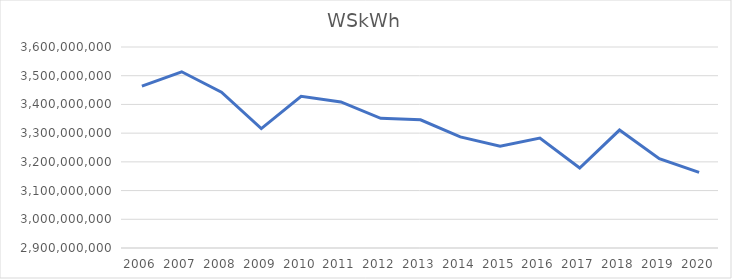
| Category |  WSkWh  |
|---|---|
| 2006.0 | 3463554919 |
| 2007.0 | 3513738064 |
| 2008.0 | 3442614476 |
| 2009.0 | 3315882997 |
| 2010.0 | 3428161401.37 |
| 2011.0 | 3408628157.038 |
| 2012.0 | 3351442979.309 |
| 2013.0 | 3346449708.869 |
| 2014.0 | 3287119476.985 |
| 2015.0 | 3254201945.172 |
| 2016.0 | 3282717042.692 |
| 2017.0 | 3178422069.249 |
| 2018.0 | 3310791494.675 |
| 2019.0 | 3211003829.11 |
| 2020.0 | 3163553020.316 |